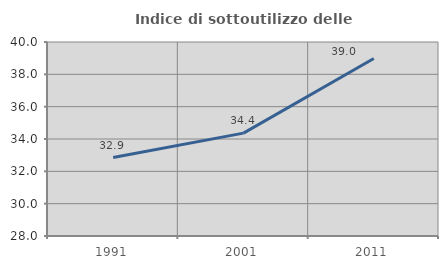
| Category | Indice di sottoutilizzo delle abitazioni  |
|---|---|
| 1991.0 | 32.852 |
| 2001.0 | 34.364 |
| 2011.0 | 38.983 |